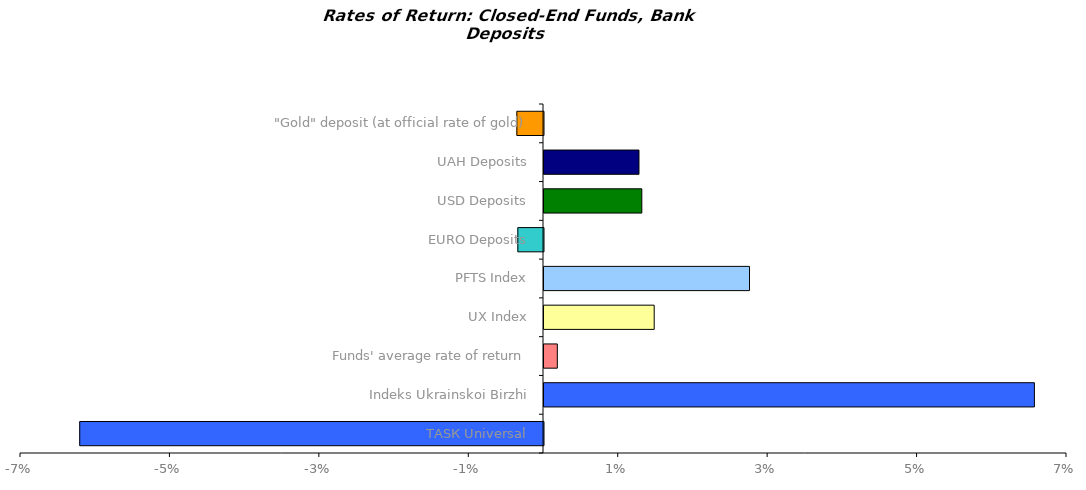
| Category | Series 0 |
|---|---|
| ТАSК Universal | -0.062 |
| Іndeks Ukrainskoi Birzhi | 0.066 |
| Funds' average rate of return | 0.002 |
| UX Index | 0.015 |
| PFTS Index | 0.028 |
| EURO Deposits | -0.003 |
| USD Deposits | 0.013 |
| UAH Deposits | 0.013 |
| "Gold" deposit (at official rate of gold) | -0.004 |